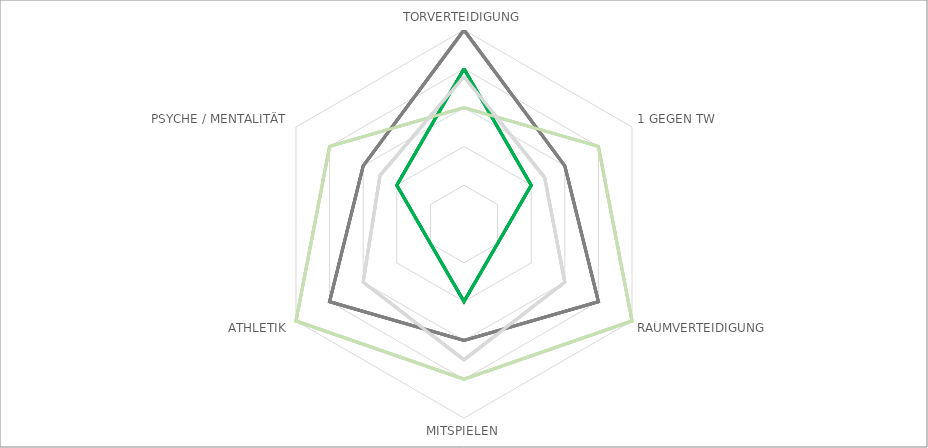
| Category | TW 1 | TW 2 | TW 3 | TW 4 |
|---|---|---|---|---|
| TORVERTEIDIGUNG | 4 | 5 | 3 | 3.8 |
| 1 GEGEN TW | 2 | 3 | 4 | 2.4 |
| RAUMVERTEIDIGUNG | 1 | 4 | 5 | 3 |
| MITSPIELEN | 2 | 3 | 4 | 3.5 |
| ATHLETIK | 1 | 4 | 5 | 3 |
| PSYCHE / MENTALITÄT | 2 | 3 | 4 | 2.5 |